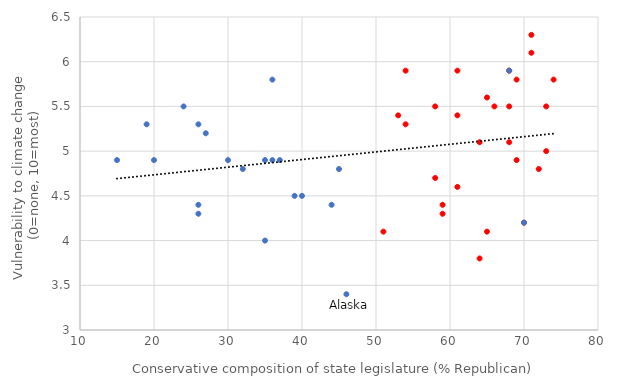
| Category | Vulnerability score (6=max) |
|---|---|
| 74.0 | 5.8 |
| 46.0 | 3.4 |
| 53.0 | 5.4 |
| 71.0 | 6.1 |
| 24.0 | 5.5 |
| 35.0 | 4 |
| 30.0 | 4.9 |
| 36.0 | 4.9 |
| nan | 4.5 |
| 71.0 | 6.3 |
| 65.0 | 5.6 |
| 19.0 | 5.3 |
| 70.0 | 4.2 |
| 37.0 | 4.9 |
| 73.0 | 5 |
| 69.0 | 4.9 |
| 64.0 | 5.1 |
| 68.0 | 5.9 |
| 61.0 | 5.9 |
| 40.0 | 4.5 |
| 26.0 | 4.4 |
| 15.0 | 4.9 |
| 58.0 | 4.7 |
| 44.0 | 4.4 |
| 68.0 | 5.9 |
| 61.0 | 5.4 |
| 59.0 | 4.3 |
| 61.0 | 4.6 |
| 35.0 | 4.9 |
| 51.0 | 4.1 |
| 27.0 | 5.2 |
| 36.0 | 5.8 |
| 26.0 | 5.3 |
| 66.0 | 5.5 |
| 65.0 | 4.1 |
| 68.0 | 5.1 |
| 68.0 | 5.5 |
| 32.0 | 4.8 |
| 54.0 | 5.3 |
| 20.0 | 4.9 |
| 54.0 | 5.9 |
| 72.0 | 4.8 |
| 73.0 | 5.5 |
| 58.0 | 5.5 |
| 64.0 | 3.8 |
| 26.0 | 4.3 |
| 45.0 | 4.8 |
| 39.0 | 4.5 |
| 69.0 | 5.8 |
| 59.0 | 4.4 |
| 70.0 | 4.2 |